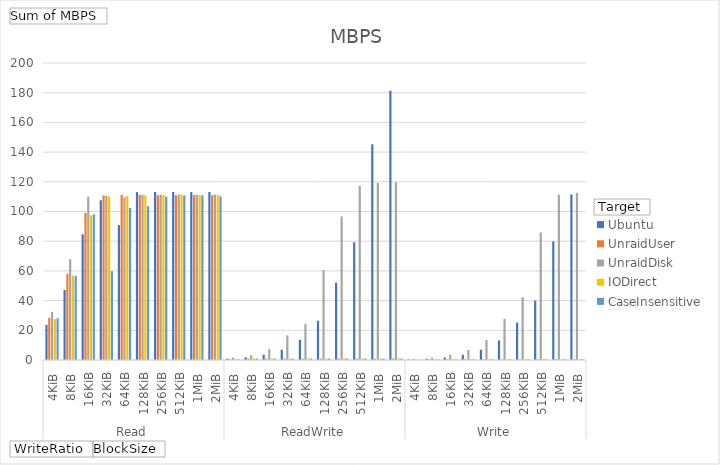
| Category | Ubuntu | UnraidUser | UnraidDisk | IODirect | CaseInsensitive |
|---|---|---|---|---|---|
| 0 | 23.69 | 28.281 | 32.401 | 27.506 | 28.179 |
| 1 | 47.24 | 58.064 | 67.813 | 56.942 | 56.699 |
| 2 | 84.64 | 99.013 | 109.97 | 97.38 | 98.123 |
| 3 | 107.598 | 110.856 | 110.663 | 110.058 | 59.815 |
| 4 | 90.784 | 111.141 | 109.614 | 110.292 | 102.395 |
| 5 | 113.057 | 111.254 | 111.291 | 110.899 | 103.623 |
| 6 | 113.121 | 111.017 | 111.302 | 111.142 | 110.01 |
| 7 | 113.138 | 110.988 | 111.529 | 111.321 | 110.792 |
| 8 | 113.083 | 111.125 | 111.342 | 111.2 | 110.908 |
| 9 | 113.15 | 111.017 | 111.367 | 111.233 | 110.217 |
| 10 | 0.915 | 0.448 | 1.631 | 0.536 | 0.493 |
| 11 | 1.815 | 0.887 | 3.298 | 1.107 | 0.97 |
| 12 | 3.528 | 0.895 | 7.309 | 1.057 | 0.928 |
| 13 | 6.916 | 0.897 | 16.59 | 1.014 | 0.912 |
| 14 | 13.603 | 0.937 | 24.174 | 1.083 | 0.965 |
| 15 | 26.37 | 0.896 | 60.433 | 1.077 | 0.954 |
| 16 | 52.108 | 0.944 | 96.662 | 1.1 | 0.996 |
| 17 | 79.233 | 0.892 | 117.221 | 1.104 | 0.962 |
| 18 | 145.233 | 0.875 | 119.267 | 1.025 | 0.975 |
| 19 | 181.283 | 0.95 | 119.683 | 1.083 | 0.983 |
| 20 | 0.443 | 0.224 | 0.742 | 0.272 | 0.255 |
| 21 | 0.89 | 0.44 | 1.555 | 0.537 | 0.455 |
| 22 | 1.771 | 0.452 | 3.584 | 0.499 | 0.464 |
| 23 | 3.53 | 0.453 | 6.71 | 0.533 | 0.476 |
| 24 | 6.937 | 0.456 | 13.461 | 0.523 | 0.479 |
| 25 | 13.2 | 0.455 | 27.685 | 0.532 | 0.49 |
| 26 | 25.117 | 0.46 | 42.248 | 0.556 | 0.504 |
| 27 | 39.958 | 0.496 | 85.788 | 0.612 | 0.55 |
| 28 | 79.875 | 0.542 | 111.192 | 0.542 | 0.6 |
| 29 | 111.467 | 0.533 | 112.567 | 0.583 | 0.583 |